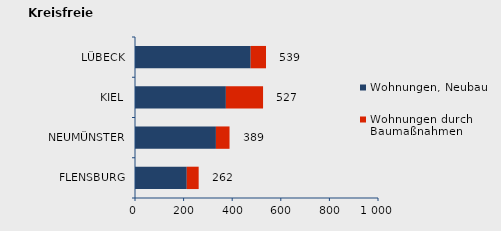
| Category | Wohnungen, Neubau | Wohnungen durch Baumaßnahmen | Series 2 |
|---|---|---|---|
| FLENSBURG | 213 | 49 | 262 |
| NEUMÜNSTER | 333 | 56 | 389 |
| KIEL | 374 | 153 | 527 |
| LÜBECK | 476 | 63 | 539 |